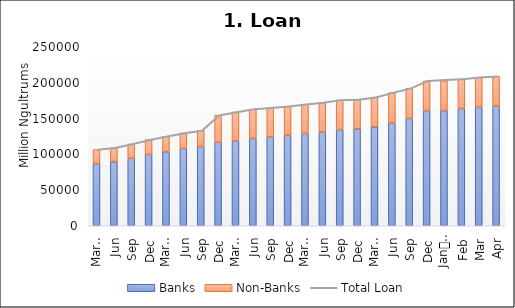
| Category | Banks | Non-Banks |
|---|---|---|
| 0 | 86839.062 | 19536.13 |
| 1 | 89492.789 | 19317.924 |
| 2 | 94257.106 | 19993.763 |
| 3 | 99542.627 | 20696.164 |
| 4 | 103455.022 | 21541.616 |
| 5 | 107823.786 | 21766.128 |
| 6 | 110793.514 | 22289.762 |
| 7 | 116541.685 | 37784.488 |
| 8 | 118433.441 | 40493.857 |
| 9 | 121831.338 | 40869.086 |
| 10 | 123947.936 | 40898.135 |
| 11 | 126363.799 | 40625.692 |
| 12 | 128951.639 | 40851.287 |
| 13 | 130897.833 | 41243.55 |
| 14 | 134359.87 | 41428.68 |
| 15 | 135415.887 | 40793.4 |
| 16 | 138284.661 | 41288.566 |
| 17 | 143532.338 | 42375.24 |
| 18 | 149966.968 | 41992.436 |
| 19 | 160873.72 | 41509.575 |
| 20 | 160873.72 | 41509.575 |
| 21 | 163784.222 | 41233.942 |
| 22 | 165428.061 | 41861.82 |
| 23 | 167303.912 | 41496.685 |